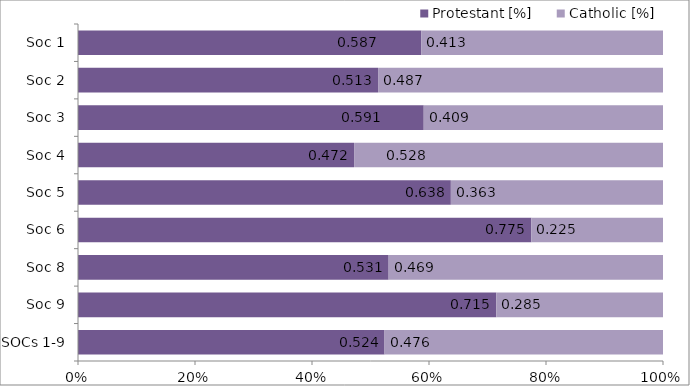
| Category | Protestant | Catholic |
|---|---|---|
| SOCs 1-9 | 0.524 | 0.476 |
| Soc 9 | 0.715 | 0.285 |
| Soc 8 | 0.531 | 0.469 |
| Soc 6 | 0.775 | 0.225 |
| Soc 5 | 0.638 | 0.363 |
| Soc 4 | 0.472 | 0.528 |
| Soc 3 | 0.591 | 0.409 |
| Soc 2 | 0.513 | 0.487 |
| Soc 1 | 0.587 | 0.413 |